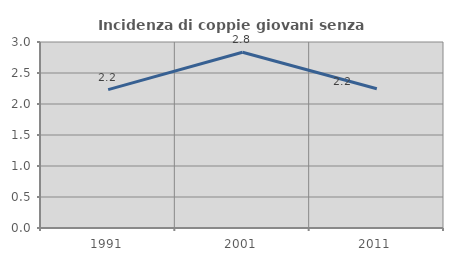
| Category | Incidenza di coppie giovani senza figli |
|---|---|
| 1991.0 | 2.231 |
| 2001.0 | 2.836 |
| 2011.0 | 2.245 |